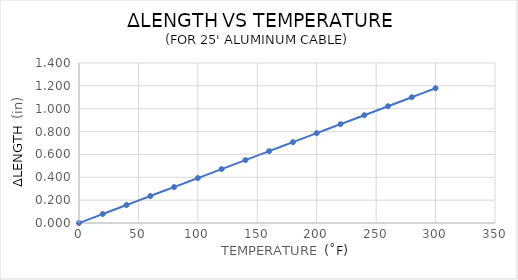
| Category | Series 0 |
|---|---|
| 0.0 | 0 |
| 20.0 | 0.079 |
| 40.0 | 0.157 |
| 60.0 | 0.236 |
| 80.0 | 0.314 |
| 100.0 | 0.393 |
| 120.0 | 0.472 |
| 140.0 | 0.55 |
| 160.0 | 0.629 |
| 180.0 | 0.707 |
| 200.0 | 0.786 |
| 220.0 | 0.865 |
| 240.0 | 0.943 |
| 260.0 | 1.022 |
| 280.0 | 1.1 |
| 300.0 | 1.179 |